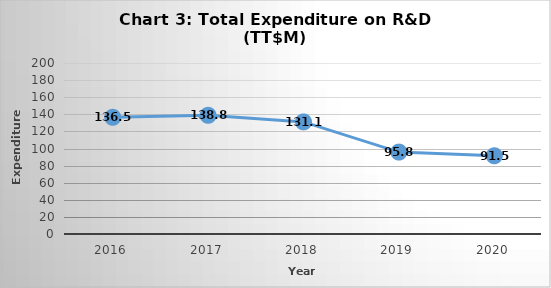
| Category | Series 0 |
|---|---|
| 2016.0 | 136.5 |
| 2017.0 | 138.8 |
| 2018.0 | 131.1 |
| 2019.0 | 95.8 |
| 2020.0 | 91.5 |